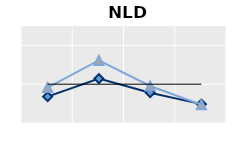
| Category | Foreign-born | Native-born | Series 1 |
|---|---|---|---|
| 15-24 | 0.68 | 0.914 | 1 |
| 25-54 | 1.144 | 1.613 | 1 |
| 55-64 | 0.781 | 0.954 | 1 |
| 65+ | 0.486 | 0.472 | 1 |